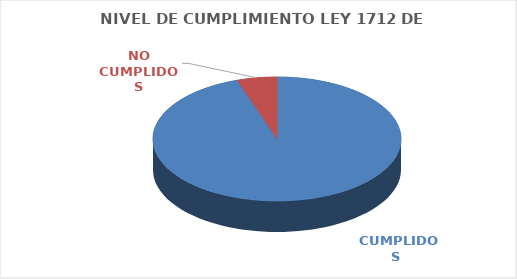
| Category | Series 0 |
|---|---|
|  CUMPLIDOS | 109 |
| NO CUMPLIDOS | 6 |